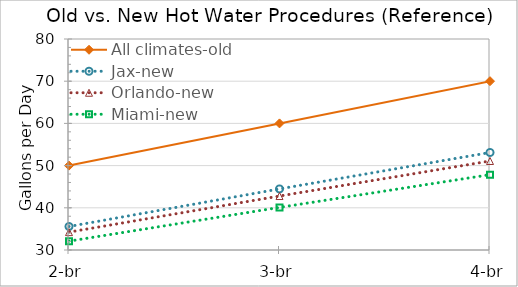
| Category | All climates-old | Jax-new | Orlando-new | Miami-new |
|---|---|---|---|---|
| 2-br | 50 | 35.573 | 34.239 | 32.1 |
| 3-br | 60 | 44.474 | 42.79 | 40.092 |
| 4-br | 70 | 53.107 | 51.087 | 47.849 |